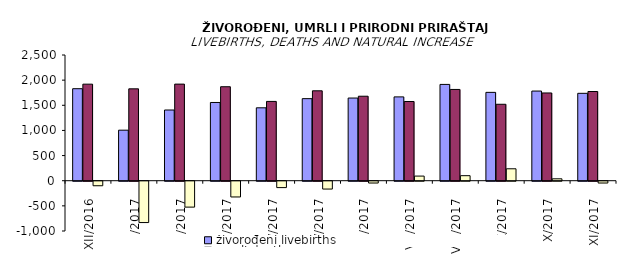
| Category | živorođeni livebirths | umrli deaths | prirodni priraštaj natural increase |
|---|---|---|---|
| XII/2016 | 1830 | 1920 | -90 |
| I/2017 | 1005 | 1827 | -822 |
| II/2017 | 1406 | 1921 | -515 |
| III/2017 | 1556 | 1869 | -313 |
| IV/2017 | 1450 | 1577 | -127 |
| V/2017 | 1632 | 1788 | -156 |
| VI/2017 | 1644 | 1680 | -36 |
| VII/2017 | 1667 | 1575 | 92 |
| VIII/2017 | 1915 | 1815 | 100 |
| IX/2017 | 1757 | 1520 | 237 |
| X/2017 | 1783 | 1745 | 38 |
| XI/2017 | 1738 | 1774 | -36 |